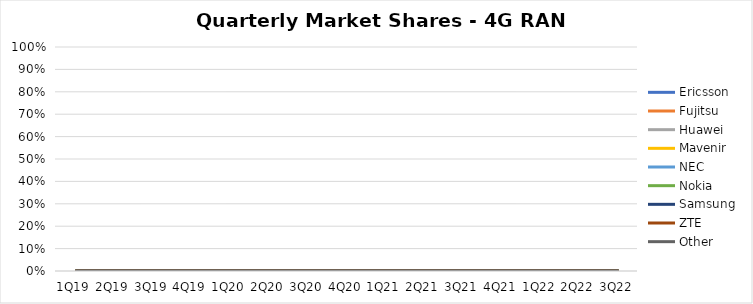
| Category | Ericsson | Fujitsu | Huawei | Mavenir | NEC | Nokia | Samsung | ZTE | Other |
|---|---|---|---|---|---|---|---|---|---|
| 1Q19 | 0 | 0 | 0 | 0 | 0 | 0 | 0 | 0 | 0 |
| 2Q19 | 0 | 0 | 0 | 0 | 0 | 0 | 0 | 0 | 0 |
| 3Q19 | 0 | 0 | 0 | 0 | 0 | 0 | 0 | 0 | 0 |
| 4Q19 | 0 | 0 | 0 | 0 | 0 | 0 | 0 | 0 | 0 |
| 1Q20 | 0 | 0 | 0 | 0 | 0 | 0 | 0 | 0 | 0 |
| 2Q20 | 0 | 0 | 0 | 0 | 0 | 0 | 0 | 0 | 0 |
| 3Q20 | 0 | 0 | 0 | 0 | 0 | 0 | 0 | 0 | 0 |
| 4Q20 | 0 | 0 | 0 | 0 | 0 | 0 | 0 | 0 | 0 |
| 1Q21 | 0 | 0 | 0 | 0 | 0 | 0 | 0 | 0 | 0 |
| 2Q21 | 0 | 0 | 0 | 0 | 0 | 0 | 0 | 0 | 0 |
| 3Q21 | 0 | 0 | 0 | 0 | 0 | 0 | 0 | 0 | 0 |
| 4Q21 | 0 | 0 | 0 | 0 | 0 | 0 | 0 | 0 | 0 |
| 1Q22 | 0 | 0 | 0 | 0 | 0 | 0 | 0 | 0 | 0 |
| 2Q22 | 0 | 0 | 0 | 0 | 0 | 0 | 0 | 0 | 0 |
| 3Q22 | 0 | 0 | 0 | 0 | 0 | 0 | 0 | 0 | 0 |